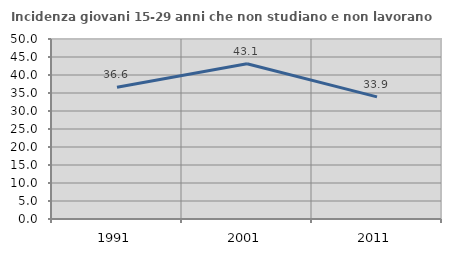
| Category | Incidenza giovani 15-29 anni che non studiano e non lavorano  |
|---|---|
| 1991.0 | 36.591 |
| 2001.0 | 43.137 |
| 2011.0 | 33.913 |